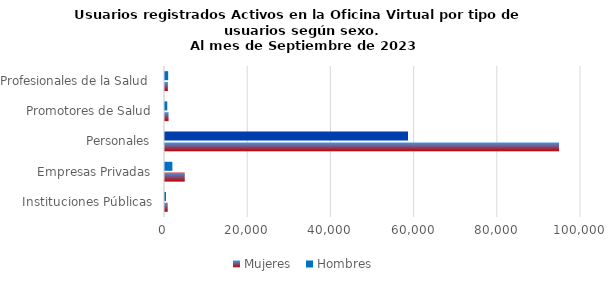
| Category | Mujeres | Hombres |
|---|---|---|
| Instituciones Públicas | 652 | 239 |
| Empresas Privadas | 4754 | 1776 |
| Personales | 94730 | 58416 |
| Promotores de Salud | 856 | 546 |
| Profesionales de la Salud | 693 | 760 |